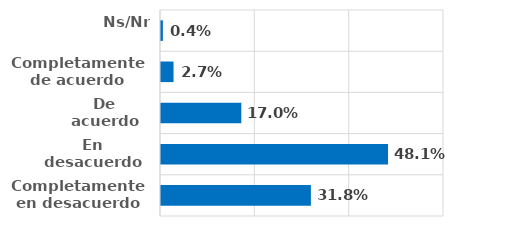
| Category | Series 0 |
|---|---|
| Completamente en desacuerdo | 0.318 |
| En desacuerdo | 0.481 |
| De acuerdo | 0.17 |
| Completamente de acuerdo | 0.027 |
| Ns/Nr | 0.004 |